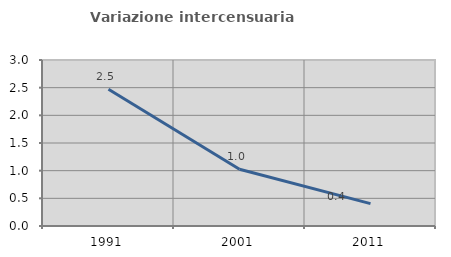
| Category | Variazione intercensuaria annua |
|---|---|
| 1991.0 | 2.473 |
| 2001.0 | 1.026 |
| 2011.0 | 0.404 |